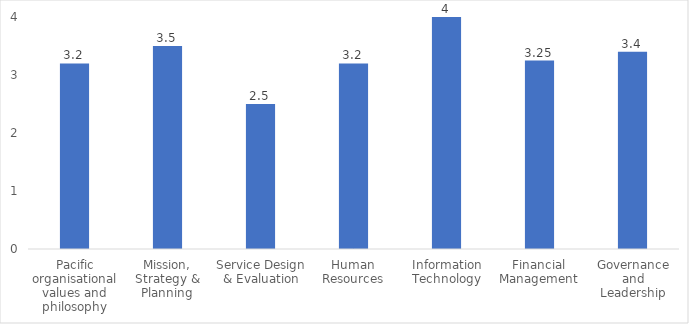
| Category | Series 0 |
|---|---|
| Pacific organisational values and philosophy | 3.2 |
| Mission, Strategy & Planning | 3.5 |
| Service Design & Evaluation | 2.5 |
| Human Resources | 3.2 |
| Information Technology | 4 |
| Financial Management | 3.25 |
| Governance and Leadership | 3.4 |